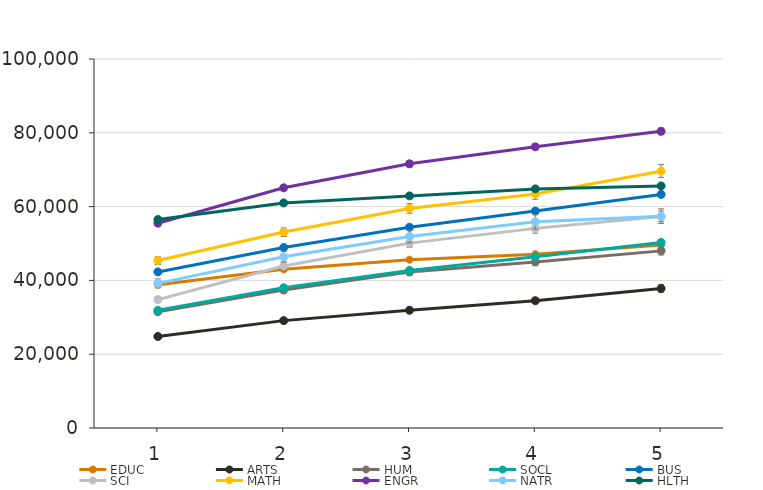
| Category | EDUC | ARTS | HUM | SOCL | BUS | SCI | MATH | ENGR | NATR | HLTH |
|---|---|---|---|---|---|---|---|---|---|---|
| 1.0 | 38800 | 24800 | 31500 | 31900 | 42300 | 34800 | 45400 | 55500 | 39200 | 56500 |
| 2.0 | 43000 | 29100 | 37400 | 38000 | 48900 | 43900 | 53100 | 65100 | 46400 | 61000 |
| 3.0 | 45600 | 31900 | 42300 | 42700 | 54400 | 50100 | 59500 | 71600 | 51900 | 62900 |
| 4.0 | 47100 | 34500 | 45000 | 46400 | 58800 | 54100 | 63400 | 76200 | 55900 | 64800 |
| 5.0 | 49600 | 37800 | 48000 | 50300 | 63300 | 57300 | 69600 | 80400 | 57400 | 65600 |